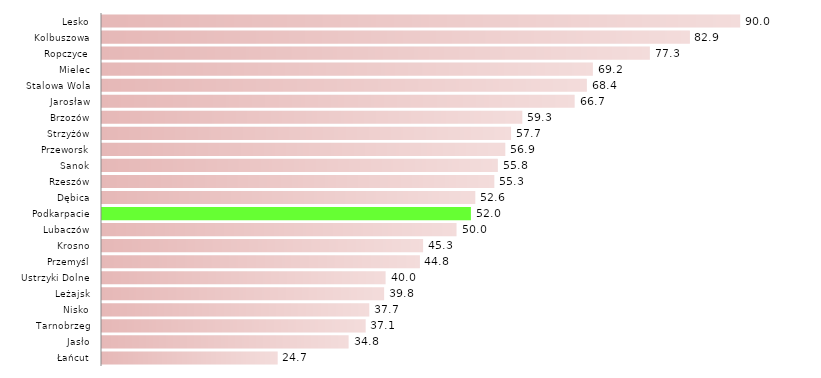
| Category | a |
|---|---|
| Łańcut | 24.731 |
| Jasło | 34.783 |
| Tarnobrzeg | 37.143 |
| Nisko | 37.681 |
| Leżajsk | 39.785 |
| Ustrzyki Dolne | 40 |
| Przemyśl | 44.776 |
| Krosno | 45.283 |
| Lubaczów | 50 |
| Podkarpacie | 52.032 |
| Dębica | 52.632 |
| Rzeszów | 55.313 |
| Sanok | 55.833 |
| Przeworsk | 56.863 |
| Strzyżów | 57.692 |
| Brzozów | 59.259 |
| Jarosław | 66.667 |
| Stalowa Wola | 68.387 |
| Mielec | 69.231 |
| Ropczyce | 77.273 |
| Kolbuszowa | 82.857 |
| Lesko | 90 |